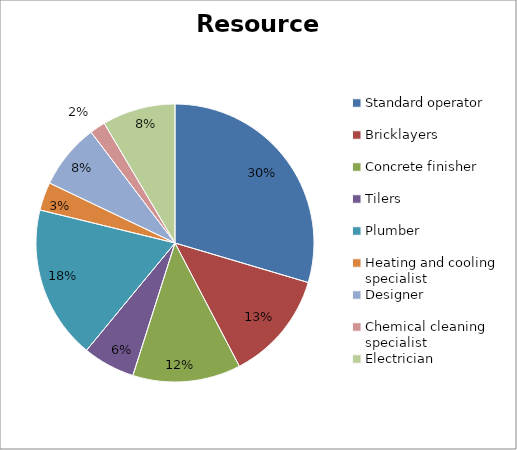
| Category | data |
|---|---|
| Standard operator | 7800 |
| Bricklayers | 3360 |
| Concrete finisher | 3312 |
| Tilers | 1600 |
| Plumber | 4704 |
| Heating and cooling specialist | 864 |
| Designer | 2000 |
| Chemical cleaning specialist | 480 |
| Electrician | 2240 |